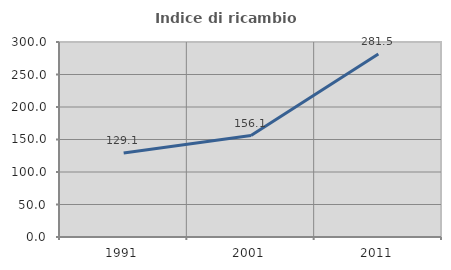
| Category | Indice di ricambio occupazionale  |
|---|---|
| 1991.0 | 129.114 |
| 2001.0 | 156.061 |
| 2011.0 | 281.481 |